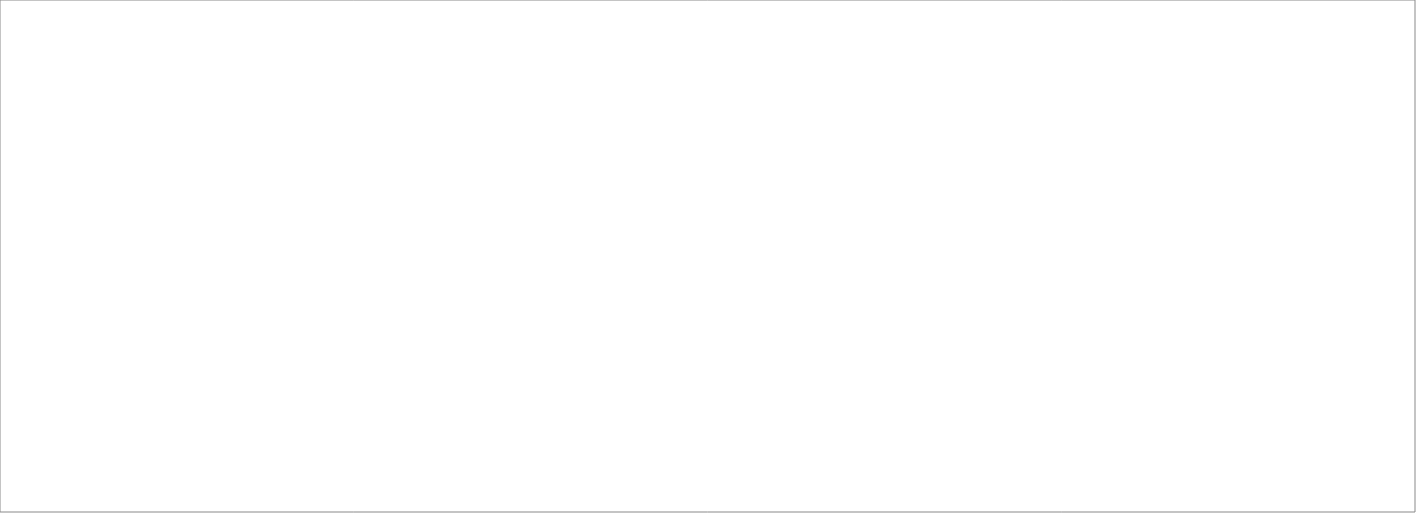
| Category | Total |
|---|---|
| Assessio Sverige AB | 100 |
| Michael Catenacci AB | 70 |
| Talogy Sweden AB | 70 |
| Randstad AB | 70 |
| Source Executive Recruitment Sweden AB | 52.5 |